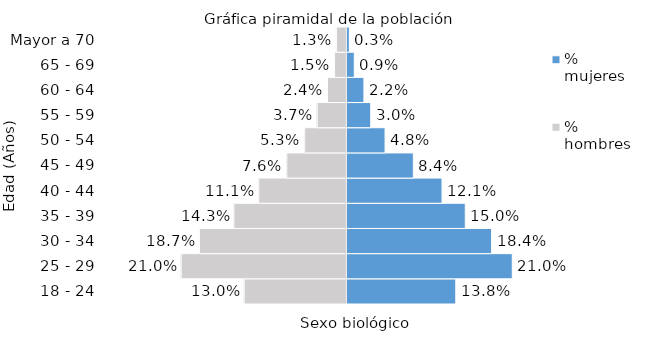
| Category | % hombres | % mujeres |
|---|---|---|
| 18 - 24 | -0.13 | 0.138 |
| 25 - 29 | -0.21 | 0.21 |
| 30 - 34 | -0.187 | 0.184 |
| 35 - 39 | -0.143 | 0.15 |
| 40 - 44 | -0.111 | 0.121 |
| 45 - 49 | -0.076 | 0.084 |
| 50 - 54 | -0.053 | 0.048 |
| 55 - 59 | -0.037 | 0.03 |
| 60 - 64 | -0.024 | 0.022 |
| 65 - 69 | -0.015 | 0.009 |
| Mayor a 70 | -0.013 | 0.003 |